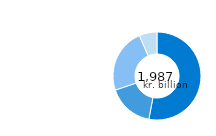
| Category | Series 0 |
|---|---|
| Bonds | 1053 |
| Investment fund shares | 335 |
| Stocks | 470 |
| Other financial asstes | 130 |